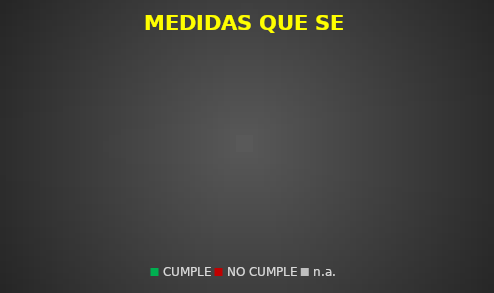
| Category | Series 0 |
|---|---|
| CUMPLE | 0 |
| NO CUMPLE | 0 |
| n.a. | 0 |